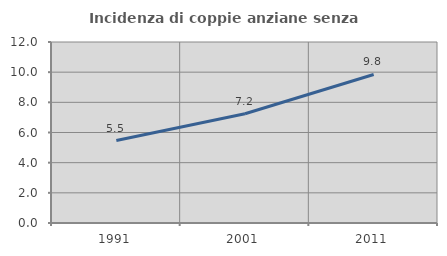
| Category | Incidenza di coppie anziane senza figli  |
|---|---|
| 1991.0 | 5.466 |
| 2001.0 | 7.243 |
| 2011.0 | 9.848 |